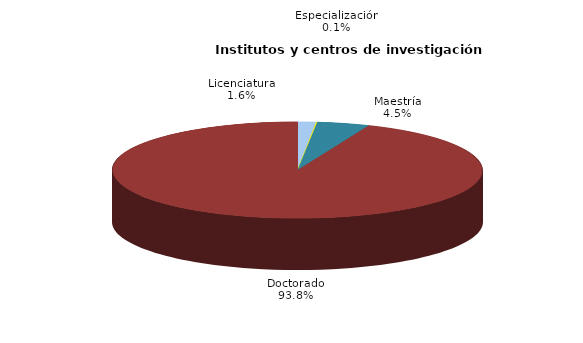
| Category | Series 0 |
|---|---|
| Licenciatura | 15 |
| Especialización | 1 |
| Maestría | 43 |
| Doctorado | 887 |